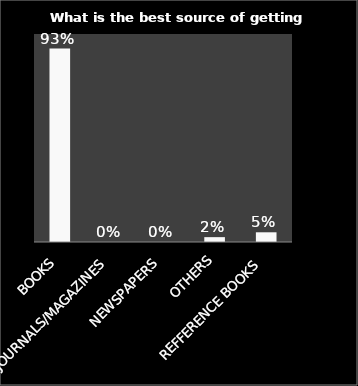
| Category | Series 0 |
|---|---|
| BOOKS | 0.93 |
| JOURNALS/MAGAZINES | 0 |
| NEWSPAPERS | 0 |
| OTHERS | 0.023 |
| REFFERENCE BOOKS | 0.047 |